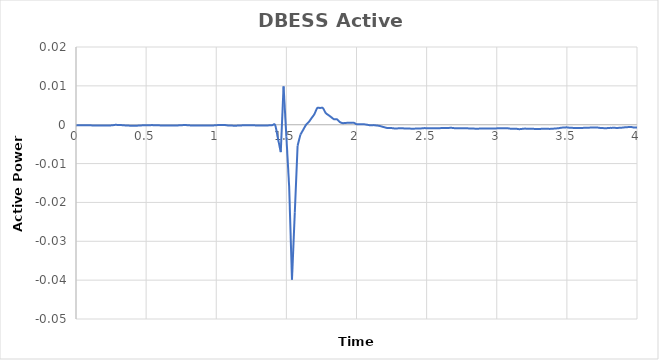
| Category | DBESS Active Power |
|---|---|
| 0.0 | 0 |
| 0.02 | 0 |
| 0.04 | 0 |
| 0.06 | 0 |
| 0.08 | 0 |
| 0.1 | 0 |
| 0.12 | 0 |
| 0.14 | 0 |
| 0.16 | 0 |
| 0.18 | 0 |
| 0.2 | 0 |
| 0.22 | 0 |
| 0.24 | 0 |
| 0.26 | 0 |
| 0.28 | 0 |
| 0.3 | 0 |
| 0.32 | 0 |
| 0.34 | 0 |
| 0.36 | 0 |
| 0.38 | 0 |
| 0.4 | 0 |
| 0.42 | 0 |
| 0.44 | 0 |
| 0.46 | 0 |
| 0.48 | 0 |
| 0.5 | 0 |
| 0.52 | 0 |
| 0.54 | 0 |
| 0.56 | 0 |
| 0.58 | 0 |
| 0.6 | 0 |
| 0.62 | 0 |
| 0.64 | 0 |
| 0.66 | 0 |
| 0.68 | 0 |
| 0.7 | 0 |
| 0.72 | 0 |
| 0.74 | 0 |
| 0.76 | 0 |
| 0.78 | 0 |
| 0.8 | 0 |
| 0.82 | 0 |
| 0.84 | 0 |
| 0.86 | 0 |
| 0.88 | 0 |
| 0.9 | 0 |
| 0.92 | 0 |
| 0.94 | 0 |
| 0.96 | 0 |
| 0.98 | 0 |
| 1.0 | 0 |
| 1.02 | 0 |
| 1.04 | 0 |
| 1.06 | 0 |
| 1.08 | 0 |
| 1.1 | 0 |
| 1.12 | 0 |
| 1.14 | 0 |
| 1.16 | 0 |
| 1.18 | 0 |
| 1.2 | 0 |
| 1.22 | 0 |
| 1.24 | 0 |
| 1.26 | 0 |
| 1.28 | 0 |
| 1.3 | 0 |
| 1.32 | 0 |
| 1.34 | 0 |
| 1.36 | 0 |
| 1.38 | 0 |
| 1.4 | 0 |
| 1.42 | 0 |
| 1.44 | -0.004 |
| 1.46 | -0.007 |
| 1.48 | 0.01 |
| 1.5 | -0.003 |
| 1.52 | -0.016 |
| 1.54 | -0.04 |
| 1.56 | -0.023 |
| 1.58 | -0.005 |
| 1.6 | -0.003 |
| 1.62 | -0.001 |
| 1.64 | 0 |
| 1.66 | 0.001 |
| 1.68 | 0.002 |
| 1.7 | 0.003 |
| 1.72 | 0.004 |
| 1.74 | 0.004 |
| 1.76 | 0.004 |
| 1.78 | 0.003 |
| 1.8 | 0.002 |
| 1.82 | 0.002 |
| 1.84 | 0.001 |
| 1.86 | 0.001 |
| 1.88 | 0.001 |
| 1.9 | 0 |
| 1.92 | 0 |
| 1.94 | 0 |
| 1.96 | 0.001 |
| 1.98 | 0.001 |
| 2.0 | 0 |
| 2.02 | 0 |
| 2.04 | 0 |
| 2.06 | 0 |
| 2.08 | 0 |
| 2.1 | 0 |
| 2.12 | 0 |
| 2.14 | 0 |
| 2.16 | 0 |
| 2.18 | 0 |
| 2.2 | -0.001 |
| 2.22 | -0.001 |
| 2.24 | -0.001 |
| 2.26 | -0.001 |
| 2.28 | -0.001 |
| 2.3 | -0.001 |
| 2.32 | -0.001 |
| 2.34 | -0.001 |
| 2.36 | -0.001 |
| 2.38 | -0.001 |
| 2.4 | -0.001 |
| 2.42 | -0.001 |
| 2.44 | -0.001 |
| 2.46 | -0.001 |
| 2.48 | -0.001 |
| 2.5 | -0.001 |
| 2.52 | -0.001 |
| 2.54 | -0.001 |
| 2.56 | -0.001 |
| 2.58 | -0.001 |
| 2.6 | -0.001 |
| 2.62 | -0.001 |
| 2.64 | -0.001 |
| 2.66 | -0.001 |
| 2.68 | -0.001 |
| 2.7 | -0.001 |
| 2.72 | -0.001 |
| 2.74 | -0.001 |
| 2.76 | -0.001 |
| 2.78 | -0.001 |
| 2.8 | -0.001 |
| 2.82 | -0.001 |
| 2.84 | -0.001 |
| 2.86 | -0.001 |
| 2.88 | -0.001 |
| 2.9 | -0.001 |
| 2.92 | -0.001 |
| 2.94 | -0.001 |
| 2.96 | -0.001 |
| 2.98 | -0.001 |
| 3.0 | -0.001 |
| 3.02 | -0.001 |
| 3.04 | -0.001 |
| 3.06 | -0.001 |
| 3.08 | -0.001 |
| 3.1 | -0.001 |
| 3.12 | -0.001 |
| 3.14 | -0.001 |
| 3.16 | -0.001 |
| 3.18 | -0.001 |
| 3.2 | -0.001 |
| 3.22 | -0.001 |
| 3.24 | -0.001 |
| 3.26 | -0.001 |
| 3.28 | -0.001 |
| 3.3 | -0.001 |
| 3.32 | -0.001 |
| 3.34 | -0.001 |
| 3.36 | -0.001 |
| 3.38 | -0.001 |
| 3.4 | -0.001 |
| 3.42 | -0.001 |
| 3.44 | -0.001 |
| 3.46 | -0.001 |
| 3.48 | -0.001 |
| 3.5 | -0.001 |
| 3.52 | -0.001 |
| 3.54 | -0.001 |
| 3.56 | -0.001 |
| 3.58 | -0.001 |
| 3.6 | -0.001 |
| 3.62 | -0.001 |
| 3.64 | -0.001 |
| 3.66 | -0.001 |
| 3.68 | -0.001 |
| 3.7 | -0.001 |
| 3.72 | -0.001 |
| 3.74 | -0.001 |
| 3.76 | -0.001 |
| 3.78 | -0.001 |
| 3.8 | -0.001 |
| 3.82 | -0.001 |
| 3.84 | -0.001 |
| 3.86 | -0.001 |
| 3.88 | -0.001 |
| 3.9 | -0.001 |
| 3.92 | -0.001 |
| 3.94 | -0.001 |
| 3.96 | -0.001 |
| 3.98 | -0.001 |
| 4.0 | -0.001 |